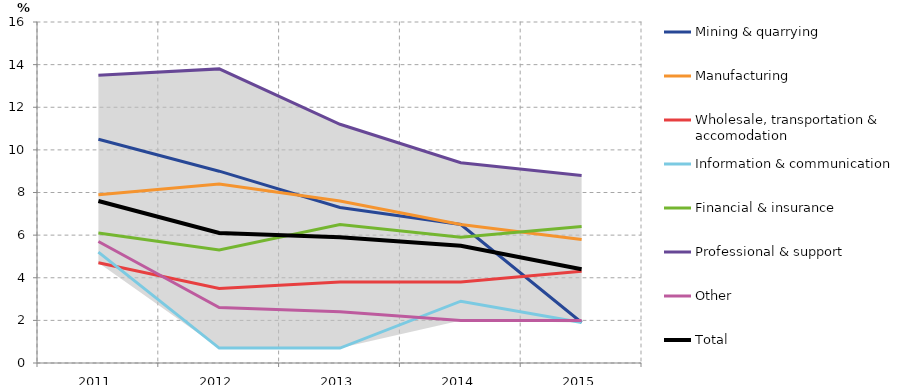
| Category | Mining & quarrying | Manufacturing | Wholesale, transportation & accomodation | Information & communication | Financial & insurance | Professional & support | Other | Total |
|---|---|---|---|---|---|---|---|---|
| 0 | 10.5 | 7.9 | 4.7 | 5.2 | 6.1 | 13.5 | 5.7 | 7.6 |
| 1 | 9 | 8.4 | 3.5 | 0.7 | 5.3 | 13.8 | 2.6 | 6.1 |
| 2 | 7.3 | 7.6 | 3.8 | 0.7 | 6.5 | 11.2 | 2.4 | 5.9 |
| 3 | 6.5 | 6.5 | 3.8 | 2.9 | 5.9 | 9.4 | 2 | 5.5 |
| 4 | 1.9 | 5.8 | 4.3 | 1.9 | 6.4 | 8.8 | 2 | 4.4 |